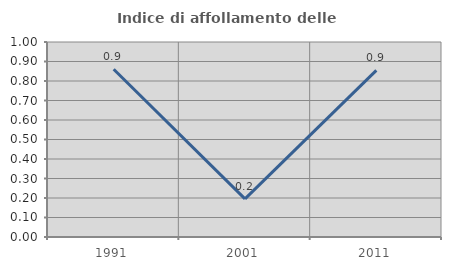
| Category | Indice di affollamento delle abitazioni  |
|---|---|
| 1991.0 | 0.86 |
| 2001.0 | 0.196 |
| 2011.0 | 0.854 |